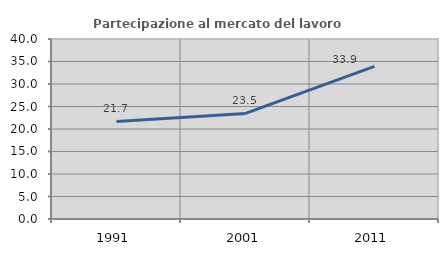
| Category | Partecipazione al mercato del lavoro  femminile |
|---|---|
| 1991.0 | 21.679 |
| 2001.0 | 23.465 |
| 2011.0 | 33.919 |